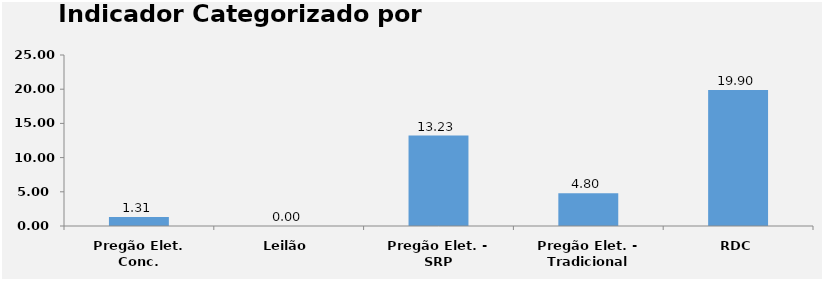
| Category | Series 0 |
|---|---|
| Pregão Elet. Conc. | 1.308 |
| Leilão | 0 |
| Pregão Elet. - SRP | 13.227 |
| Pregão Elet. - Tradicional | 4.8 |
| RDC | 19.9 |